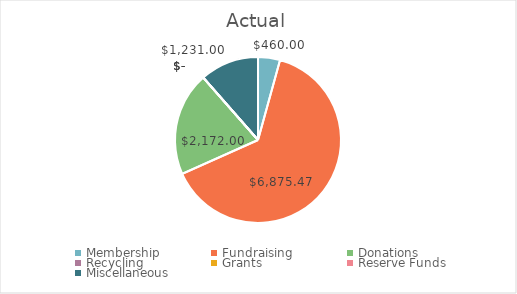
| Category | Actual |
|---|---|
| Membership | 460 |
| Fundraising | 6875.47 |
| Donations | 2172 |
| Recycling | 0 |
| Grants | 0 |
| Reserve Funds | 0 |
| Miscellaneous | 1231 |